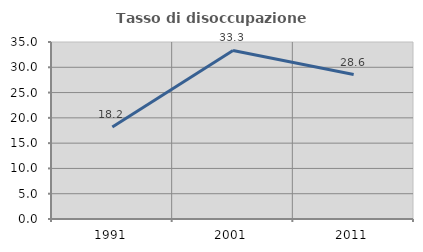
| Category | Tasso di disoccupazione giovanile  |
|---|---|
| 1991.0 | 18.182 |
| 2001.0 | 33.333 |
| 2011.0 | 28.571 |